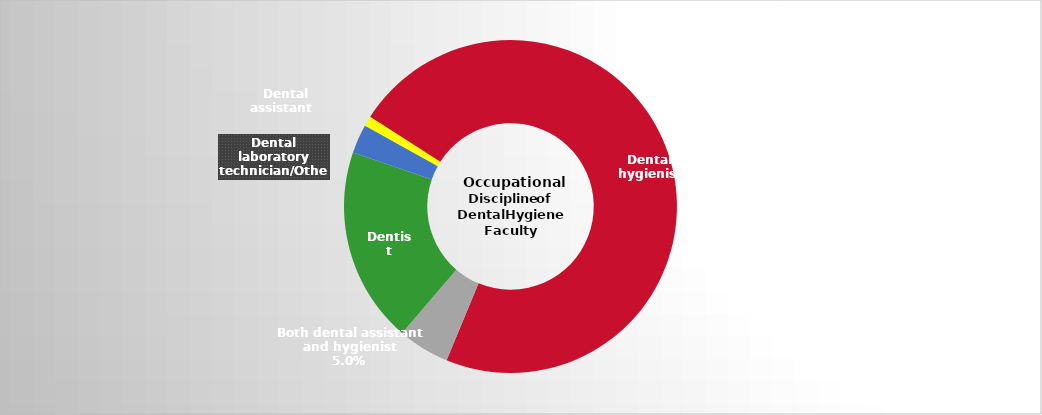
| Category | Series 2 |
|---|---|
| Dental assistant   | 0.01 |
| Dental hygienist | 0.722 |
| Both dental assistant and hygienist | 0.05 |
| Dentist | 0.19 |
| Dental laboratory technician/Other | 0.028 |